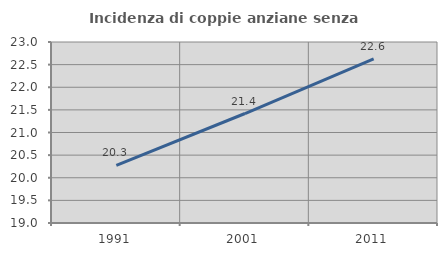
| Category | Incidenza di coppie anziane senza figli  |
|---|---|
| 1991.0 | 20.274 |
| 2001.0 | 21.42 |
| 2011.0 | 22.629 |